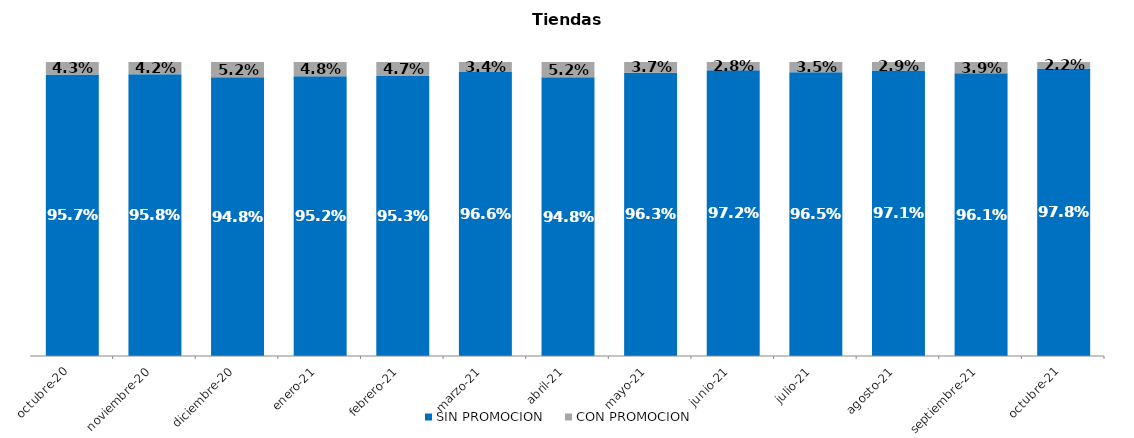
| Category | SIN PROMOCION   | CON PROMOCION   |
|---|---|---|
| 2020-10-01 | 0.957 | 0.043 |
| 2020-11-01 | 0.958 | 0.042 |
| 2020-12-01 | 0.948 | 0.052 |
| 2021-01-01 | 0.952 | 0.048 |
| 2021-02-01 | 0.953 | 0.047 |
| 2021-03-01 | 0.966 | 0.034 |
| 2021-04-01 | 0.948 | 0.052 |
| 2021-05-01 | 0.963 | 0.037 |
| 2021-06-01 | 0.972 | 0.028 |
| 2021-07-01 | 0.965 | 0.035 |
| 2021-08-01 | 0.971 | 0.029 |
| 2021-09-01 | 0.961 | 0.039 |
| 2021-10-01 | 0.978 | 0.022 |